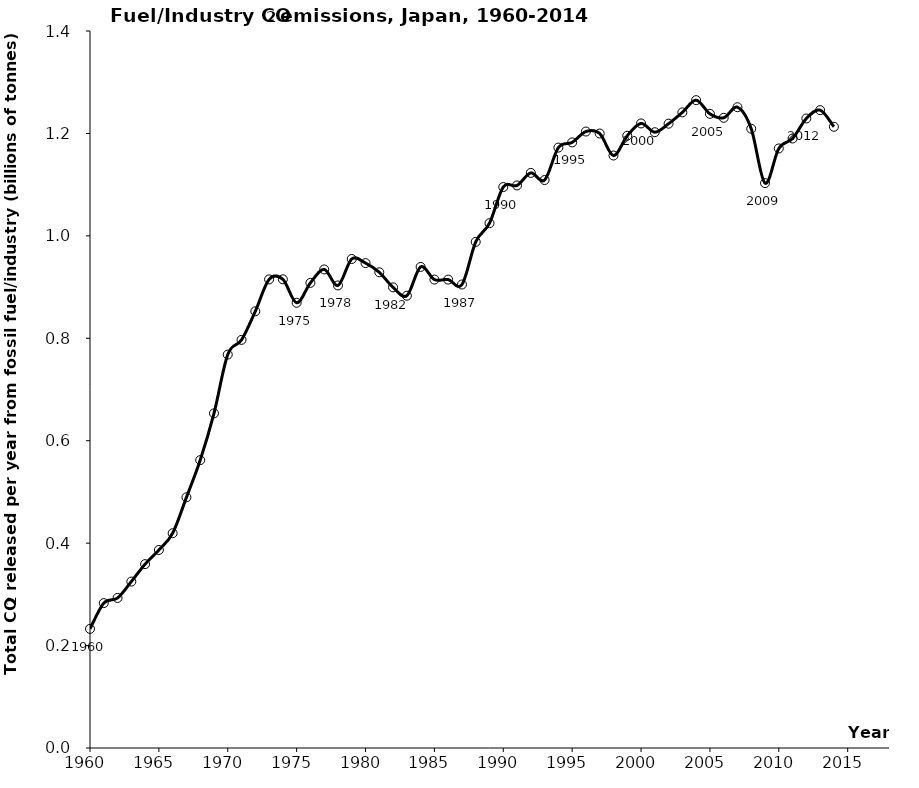
| Category | Series 0 |
|---|---|
| 1960.0 | 0.233 |
| 1961.0 | 0.283 |
| 1962.0 | 0.293 |
| 1963.0 | 0.325 |
| 1964.0 | 0.359 |
| 1965.0 | 0.387 |
| 1966.0 | 0.419 |
| 1967.0 | 0.489 |
| 1968.0 | 0.562 |
| 1969.0 | 0.653 |
| 1970.0 | 0.768 |
| 1971.0 | 0.797 |
| 1972.0 | 0.853 |
| 1973.0 | 0.915 |
| 1974.0 | 0.915 |
| 1975.0 | 0.869 |
| 1976.0 | 0.908 |
| 1977.0 | 0.934 |
| 1978.0 | 0.903 |
| 1979.0 | 0.955 |
| 1980.0 | 0.947 |
| 1981.0 | 0.929 |
| 1982.0 | 0.899 |
| 1983.0 | 0.883 |
| 1984.0 | 0.939 |
| 1985.0 | 0.915 |
| 1986.0 | 0.915 |
| 1987.0 | 0.905 |
| 1988.0 | 0.988 |
| 1989.0 | 1.025 |
| 1990.0 | 1.095 |
| 1991.0 | 1.098 |
| 1992.0 | 1.123 |
| 1993.0 | 1.109 |
| 1994.0 | 1.172 |
| 1995.0 | 1.182 |
| 1996.0 | 1.204 |
| 1997.0 | 1.2 |
| 1998.0 | 1.157 |
| 1999.0 | 1.196 |
| 2000.0 | 1.22 |
| 2001.0 | 1.202 |
| 2002.0 | 1.219 |
| 2003.0 | 1.241 |
| 2004.0 | 1.265 |
| 2005.0 | 1.238 |
| 2006.0 | 1.23 |
| 2007.0 | 1.251 |
| 2008.0 | 1.209 |
| 2009.0 | 1.103 |
| 2010.0 | 1.171 |
| 2011.0 | 1.19 |
| 2012.0 | 1.229 |
| 2013.0 | 1.245 |
| 2014.0 | 1.213 |